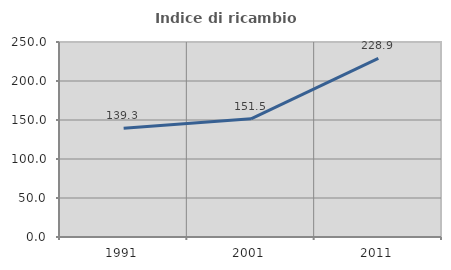
| Category | Indice di ricambio occupazionale  |
|---|---|
| 1991.0 | 139.333 |
| 2001.0 | 151.521 |
| 2011.0 | 228.916 |